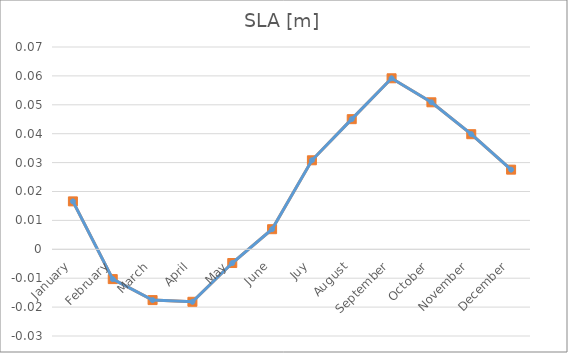
| Category | Series 1 | Series 0 |
|---|---|---|
| January | 0.017 | 0.017 |
| February | -0.01 | -0.01 |
| March | -0.018 | -0.018 |
| April | -0.018 | -0.018 |
| May | -0.005 | -0.005 |
| June | 0.007 | 0.007 |
| Juy | 0.031 | 0.031 |
| August | 0.045 | 0.045 |
| September | 0.059 | 0.059 |
| October | 0.051 | 0.051 |
| November | 0.04 | 0.04 |
| December | 0.028 | 0.028 |